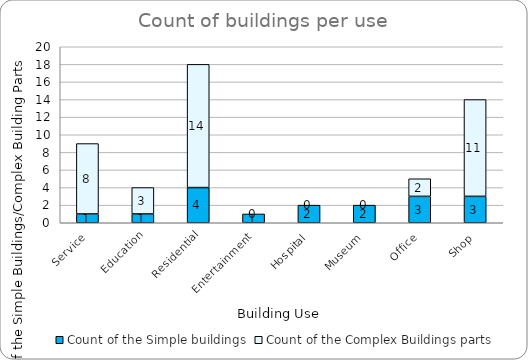
| Category | Count of the Simple buildings | Count of the Complex Buildings parts |
|---|---|---|
| Service | 1 | 8 |
| Education | 1 | 3 |
| Residential | 4 | 14 |
| Entertainment | 1 | 0 |
| Hospital | 2 | 0 |
| Museum | 2 | 0 |
| Office | 3 | 2 |
| Shop | 3 | 11 |